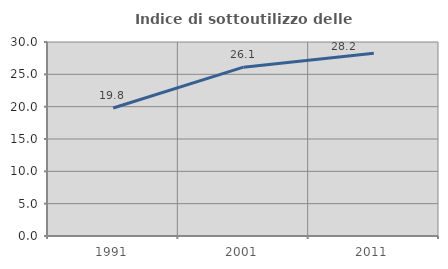
| Category | Indice di sottoutilizzo delle abitazioni  |
|---|---|
| 1991.0 | 19.793 |
| 2001.0 | 26.109 |
| 2011.0 | 28.243 |